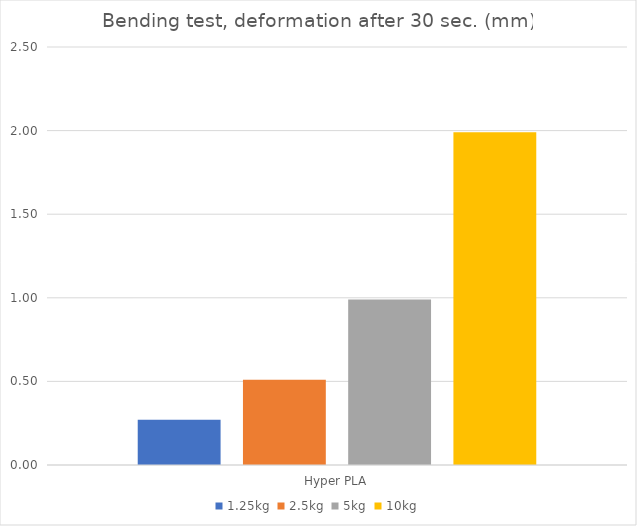
| Category | 1.25kg | 2.5kg | 5kg | 10kg |
|---|---|---|---|---|
| Hyper PLA | 0.27 | 0.51 | 0.99 | 1.99 |